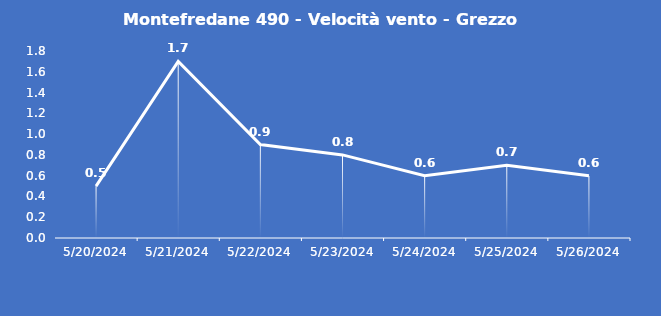
| Category | Montefredane 490 - Velocità vento - Grezzo (m/s) |
|---|---|
| 5/20/24 | 0.5 |
| 5/21/24 | 1.7 |
| 5/22/24 | 0.9 |
| 5/23/24 | 0.8 |
| 5/24/24 | 0.6 |
| 5/25/24 | 0.7 |
| 5/26/24 | 0.6 |